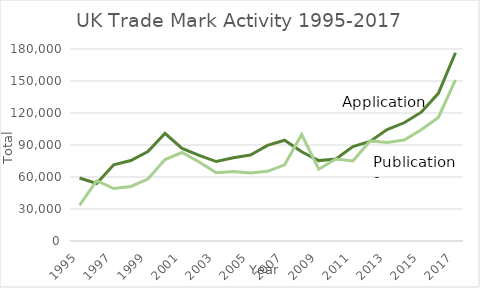
| Category | Applications | Publications |
|---|---|---|
| 1995.0 | 59053 | 33400 |
| 1996.0 | 53913 | 56531 |
| 1997.0 | 71463 | 49187 |
| 1998.0 | 75461 | 51169 |
| 1999.0 | 83942 | 58077 |
| 2000.0 | 100907 | 76290 |
| 2001.0 | 86837 | 82935 |
| 2002.0 | 80268 | 74071 |
| 2003.0 | 74495 | 63988 |
| 2004.0 | 78104 | 65175 |
| 2005.0 | 80543 | 63760 |
| 2006.0 | 89676 | 65327 |
| 2007.0 | 94473 | 71454 |
| 2008.0 | 83685 | 99834 |
| 2009.0 | 75368 | 67338 |
| 2010.0 | 76856 | 76918 |
| 2011.0 | 88604 | 75108 |
| 2012.0 | 93361 | 93818 |
| 2013.0 | 104443 | 92254 |
| 2014.0 | 110838 | 94688 |
| 2015.0 | 120792 | 104219 |
| 2016.0 | 138409 | 115865 |
| 2017.0 | 176493 | 151092 |